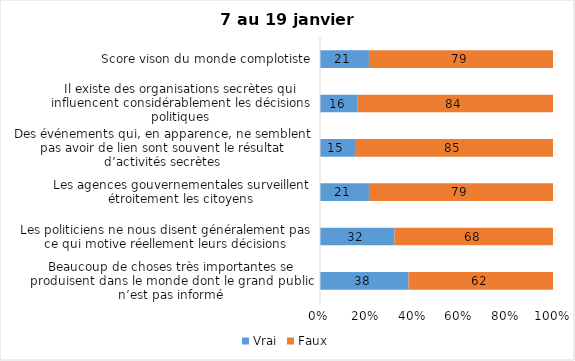
| Category | Vrai | Faux |
|---|---|---|
| Beaucoup de choses très importantes se produisent dans le monde dont le grand public n’est pas informé | 38 | 62 |
| Les politiciens ne nous disent généralement pas ce qui motive réellement leurs décisions | 32 | 68 |
| Les agences gouvernementales surveillent étroitement les citoyens | 21 | 79 |
| Des événements qui, en apparence, ne semblent pas avoir de lien sont souvent le résultat d’activités secrètes | 15 | 85 |
| Il existe des organisations secrètes qui influencent considérablement les décisions politiques | 16 | 84 |
| Score vison du monde complotiste | 21 | 79 |